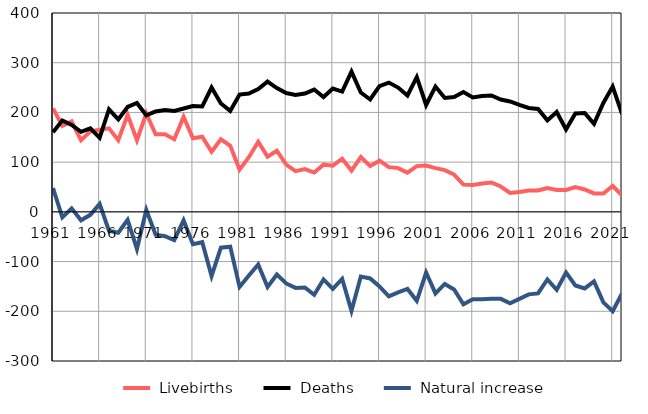
| Category |  Livebirths |  Deaths |  Natural increase |
|---|---|---|---|
| 1961.0 | 208 | 160 | 48 |
| 1962.0 | 173 | 184 | -11 |
| 1963.0 | 182 | 175 | 7 |
| 1964.0 | 144 | 161 | -17 |
| 1965.0 | 162 | 168 | -6 |
| 1966.0 | 165 | 149 | 16 |
| 1967.0 | 168 | 206 | -38 |
| 1968.0 | 144 | 186 | -42 |
| 1969.0 | 195 | 211 | -16 |
| 1970.0 | 144 | 219 | -75 |
| 1971.0 | 198 | 194 | 4 |
| 1972.0 | 156 | 202 | -46 |
| 1973.0 | 156 | 205 | -49 |
| 1974.0 | 146 | 203 | -57 |
| 1975.0 | 191 | 208 | -17 |
| 1976.0 | 148 | 213 | -65 |
| 1977.0 | 151 | 212 | -61 |
| 1978.0 | 121 | 250 | -129 |
| 1979.0 | 146 | 218 | -72 |
| 1980.0 | 133 | 203 | -70 |
| 1981.0 | 85 | 236 | -151 |
| 1982.0 | 110 | 238 | -128 |
| 1983.0 | 141 | 247 | -106 |
| 1984.0 | 111 | 262 | -151 |
| 1985.0 | 123 | 249 | -126 |
| 1986.0 | 95 | 239 | -144 |
| 1987.0 | 82 | 235 | -153 |
| 1988.0 | 86 | 238 | -152 |
| 1989.0 | 79 | 246 | -167 |
| 1990.0 | 95 | 231 | -136 |
| 1991.0 | 93 | 248 | -155 |
| 1992.0 | 107 | 242 | -135 |
| 1993.0 | 83 | 282 | -199 |
| 1994.0 | 110 | 240 | -130 |
| 1995.0 | 92 | 226 | -134 |
| 1996.0 | 103 | 253 | -150 |
| 1997.0 | 90 | 260 | -170 |
| 1998.0 | 88 | 250 | -162 |
| 1999.0 | 79 | 234 | -155 |
| 2000.0 | 92 | 271 | -179 |
| 2001.0 | 93 | 215 | -122 |
| 2002.0 | 88 | 252 | -164 |
| 2003.0 | 84 | 229 | -145 |
| 2004.0 | 75 | 231 | -156 |
| 2005.0 | 55 | 241 | -186 |
| 2006.0 | 54 | 230 | -176 |
| 2007.0 | 57 | 233 | -176 |
| 2008.0 | 59 | 234 | -175 |
| 2009.0 | 51 | 226 | -175 |
| 2010.0 | 38 | 222 | -184 |
| 2011.0 | 40 | 215 | -175 |
| 2012.0 | 43 | 209 | -166 |
| 2013.0 | 43 | 207 | -164 |
| 2014.0 | 48 | 184 | -136 |
| 2015.0 | 44 | 201 | -157 |
| 2016.0 | 44 | 166 | -122 |
| 2017.0 | 50 | 198 | -148 |
| 2018.0 | 45 | 199 | -154 |
| 2019.0 | 37 | 177 | -140 |
| 2020.0 | 37 | 219 | -182 |
| 2021.0 | 52 | 252 | -200 |
| 2022.0 | 33 | 197 | -164 |